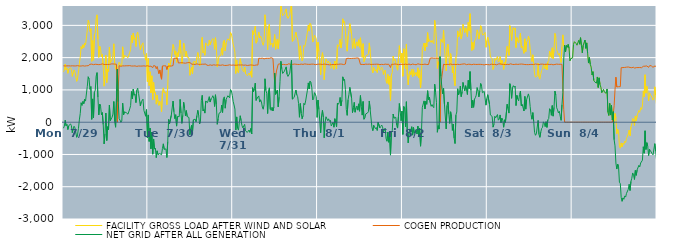
| Category | FACILITY GROSS LOAD AFTER WIND AND SOLAR | COGEN PRODUCTION | NET GRID AFTER ALL GENERATION |
|---|---|---|---|
|  Mon  7/29 | 1560 | 1747 | -187 |
|  Mon  7/29 | 1612 | 1734 | -122 |
|  Mon  7/29 | 1800 | 1741 | 59 |
|  Mon  7/29 | 1627 | 1739 | -112 |
|  Mon  7/29 | 1681 | 1745 | -64 |
|  Mon  7/29 | 1514 | 1743 | -229 |
|  Mon  7/29 | 1637 | 1746 | -109 |
|  Mon  7/29 | 1663 | 1748 | -85 |
|  Mon  7/29 | 1687 | 1742 | -55 |
|  Mon  7/29 | 1642 | 1750 | -108 |
|  Mon  7/29 | 1421 | 1747 | -326 |
|  Mon  7/29 | 1544 | 1756 | -212 |
|  Mon  7/29 | 1617 | 1743 | -126 |
|  Mon  7/29 | 1562 | 1736 | -174 |
|  Mon  7/29 | 1560 | 1743 | -183 |
|  Mon  7/29 | 1267 | 1734 | -467 |
|  Mon  7/29 | 1373 | 1752 | -379 |
|  Mon  7/29 | 1555 | 1746 | -191 |
|  Mon  7/29 | 1810 | 1740 | 70 |
|  Mon  7/29 | 2015 | 1744 | 271 |
|  Mon  7/29 | 2342 | 1740 | 602 |
|  Mon  7/29 | 2268 | 1748 | 520 |
|  Mon  7/29 | 2398 | 1749 | 649 |
|  Mon  7/29 | 2314 | 1744 | 570 |
|  Mon  7/29 | 2452 | 1738 | 714 |
|  Mon  7/29 | 2398 | 1745 | 653 |
|  Mon  7/29 | 2428 | 1747 | 681 |
|  Mon  7/29 | 2849 | 1738 | 1111 |
|  Mon  7/29 | 3157 | 1750 | 1407 |
|  Mon  7/29 | 3076 | 1737 | 1339 |
|  Mon  7/29 | 2814 | 1793 | 1021 |
|  Mon  7/29 | 2897 | 1795 | 1102 |
|  Mon  7/29 | 1887 | 1799 | 88 |
|  Mon  7/29 | 2528 | 1807 | 721 |
|  Mon  7/29 | 1921 | 1782 | 139 |
|  Mon  7/29 | 2704 | 1777 | 927 |
|  Mon  7/29 | 2785 | 1795 | 990 |
|  Mon  7/29 | 3215 | 1791 | 1424 |
|  Mon  7/29 | 3326 | 1790 | 1536 |
|  Mon  7/29 | 2575 | 1796 | 779 |
|  Mon  7/29 | 2006 | 1782 | 224 |
|  Mon  7/29 | 2354 | 1791 | 563 |
|  Mon  7/29 | 2279 | 1789 | 490 |
|  Mon  7/29 | 2021 | 1791 | 230 |
|  Mon  7/29 | 2103 | 1807 | 296 |
|  Mon  7/29 | 1726 | 1799 | -73 |
|  Mon  7/29 | 1116 | 1789 | -673 |
|  Mon  7/29 | 1437 | 1794 | -357 |
|  Mon  7/29 | 2069 | 1787 | 282 |
|  Mon  7/29 | 1228 | 1797 | -569 |
|  Mon  7/29 | 1648 | 1788 | -140 |
|  Mon  7/29 | 1573 | 1803 | -230 |
|  Mon  7/29 | 2320 | 1790 | 530 |
|  Mon  7/29 | 1835 | 1791 | 44 |
|  Mon  7/29 | 1843 | 1804 | 39 |
|  Mon  7/29 | 1925 | 1775 | 150 |
|  Mon  7/29 | 2058 | 1805 | 253 |
|  Mon  7/29 | 2429 | 1788 | 641 |
|  Mon  7/29 | 1816 | 1800 | 16 |
|  Mon  7/29 | 1641 | 1798 | -157 |
|  Mon  7/29 | 1634 | 1795 | -161 |
|  Mon  7/29 | 1641 | 0 | 1641 |
|  Mon  7/29 | 1630 | 999 | 631 |
|  Mon  7/29 | 1860 | 1750 | 110 |
|  Mon  7/29 | 1804 | 1740 | 64 |
|  Mon  7/29 | 1728 | 1732 | -4 |
|  Mon  7/29 | 1767 | 1735 | 32 |
|  Mon  7/29 | 2335 | 1745 | 590 |
|  Mon  7/29 | 1978 | 1753 | 225 |
|  Mon  7/29 | 2064 | 1744 | 320 |
|  Mon  7/29 | 2050 | 1738 | 312 |
|  Mon  7/29 | 2044 | 1748 | 296 |
|  Mon  7/29 | 2069 | 1756 | 313 |
|  Mon  7/29 | 1996 | 1748 | 248 |
|  Mon  7/29 | 1966 | 1740 | 226 |
|  Mon  7/29 | 2164 | 1752 | 412 |
|  Mon  7/29 | 2254 | 1741 | 513 |
|  Mon  7/29 | 2690 | 1740 | 950 |
|  Mon  7/29 | 2460 | 1741 | 719 |
|  Mon  7/29 | 2763 | 1740 | 1023 |
|  Mon  7/29 | 2570 | 1735 | 835 |
|  Mon  7/29 | 2613 | 1744 | 869 |
|  Mon  7/29 | 2344 | 1738 | 606 |
|  Mon  7/29 | 2717 | 1729 | 988 |
|  Mon  7/29 | 2791 | 1738 | 1053 |
|  Mon  7/29 | 2633 | 1741 | 892 |
|  Mon  7/29 | 2648 | 1742 | 906 |
|  Mon  7/29 | 2239 | 1738 | 501 |
|  Mon  7/29 | 2362 | 1728 | 634 |
|  Mon  7/29 | 2353 | 1739 | 614 |
|  Mon  7/29 | 2459 | 1746 | 713 |
|  Mon  7/29 | 2112 | 1745 | 367 |
|  Mon  7/29 | 2074 | 1735 | 339 |
|  Mon  7/29 | 1922 | 1737 | 185 |
|  Mon  7/29 | 2125 | 1735 | 390 |
|  Mon  7/29 | 1259 | 1749 | -490 |
|  Tue  7/30 | 1975 | 1751 | 224 |
|  Tue  7/30 | 1134 | 1731 | -597 |
|  Tue  7/30 | 1563 | 1747 | -184 |
|  Tue  7/30 | 910 | 1735 | -825 |
|  Tue  7/30 | 1438 | 1743 | -305 |
|  Tue  7/30 | 697 | 1689 | -992 |
|  Tue  7/30 | 1233 | 1753 | -520 |
|  Tue  7/30 | 901 | 1736 | -835 |
|  Tue  7/30 | 936 | 1739 | -803 |
|  Tue  7/30 | 558 | 1656 | -1098 |
|  Tue  7/30 | 839 | 1727 | -888 |
|  Tue  7/30 | 617 | 1620 | -1003 |
|  Tue  7/30 | 520 | 1504 | -984 |
|  Tue  7/30 | 646 | 1618 | -972 |
|  Tue  7/30 | 611 | 1588 | -977 |
|  Tue  7/30 | 321 | 1332 | -1011 |
|  Tue  7/30 | 928 | 1742 | -814 |
|  Tue  7/30 | 1063 | 1734 | -671 |
|  Tue  7/30 | 906 | 1748 | -842 |
|  Tue  7/30 | 925 | 1744 | -819 |
|  Tue  7/30 | 914 | 1743 | -829 |
|  Tue  7/30 | 537 | 1632 | -1095 |
|  Tue  7/30 | 1134 | 1734 | -600 |
|  Tue  7/30 | 1833 | 1747 | 86 |
|  Tue  7/30 | 1689 | 1740 | -51 |
|  Tue  7/30 | 1680 | 1737 | -57 |
|  Tue  7/30 | 1953 | 1740 | 213 |
|  Tue  7/30 | 2176 | 1737 | 439 |
|  Tue  7/30 | 2407 | 1754 | 653 |
|  Tue  7/30 | 2304 | 1983 | 321 |
|  Tue  7/30 | 2100 | 1989 | 111 |
|  Tue  7/30 | 2209 | 1978 | 231 |
|  Tue  7/30 | 1856 | 1978 | -122 |
|  Tue  7/30 | 2150 | 1977 | 173 |
|  Tue  7/30 | 2035 | 1834 | 201 |
|  Tue  7/30 | 2020 | 1847 | 173 |
|  Tue  7/30 | 2545 | 1839 | 706 |
|  Tue  7/30 | 2123 | 1839 | 284 |
|  Tue  7/30 | 1808 | 1844 | -36 |
|  Tue  7/30 | 2055 | 1843 | 212 |
|  Tue  7/30 | 2451 | 1834 | 617 |
|  Tue  7/30 | 2290 | 1858 | 432 |
|  Tue  7/30 | 2026 | 1828 | 198 |
|  Tue  7/30 | 2200 | 1840 | 360 |
|  Tue  7/30 | 2016 | 1841 | 175 |
|  Tue  7/30 | 2020 | 1836 | 184 |
|  Tue  7/30 | 1994 | 1849 | 145 |
|  Tue  7/30 | 1453 | 1844 | -391 |
|  Tue  7/30 | 1440 | 1835 | -395 |
|  Tue  7/30 | 1707 | 1796 | -89 |
|  Tue  7/30 | 1495 | 1805 | -310 |
|  Tue  7/30 | 1868 | 1794 | 74 |
|  Tue  7/30 | 1849 | 1793 | 56 |
|  Tue  7/30 | 1882 | 1789 | 93 |
|  Tue  7/30 | 1811 | 1798 | 13 |
|  Tue  7/30 | 2013 | 1806 | 207 |
|  Tue  7/30 | 2158 | 1790 | 368 |
|  Tue  7/30 | 1998 | 1792 | 206 |
|  Tue  7/30 | 1741 | 1794 | -53 |
|  Tue  7/30 | 1816 | 1792 | 24 |
|  Tue  7/30 | 2483 | 1802 | 681 |
|  Tue  7/30 | 2629 | 1797 | 832 |
|  Tue  7/30 | 2144 | 1798 | 346 |
|  Tue  7/30 | 2191 | 1797 | 394 |
|  Tue  7/30 | 2072 | 1791 | 281 |
|  Tue  7/30 | 2457 | 1804 | 653 |
|  Tue  7/30 | 2404 | 1769 | 635 |
|  Tue  7/30 | 2377 | 1770 | 607 |
|  Tue  7/30 | 2369 | 1758 | 611 |
|  Tue  7/30 | 2546 | 1757 | 789 |
|  Tue  7/30 | 2400 | 1776 | 624 |
|  Tue  7/30 | 2492 | 1769 | 723 |
|  Tue  7/30 | 2519 | 1761 | 758 |
|  Tue  7/30 | 2592 | 1772 | 820 |
|  Tue  7/30 | 2526 | 1778 | 748 |
|  Tue  7/30 | 2256 | 1769 | 487 |
|  Tue  7/30 | 2616 | 1767 | 849 |
|  Tue  7/30 | 2310 | 1766 | 544 |
|  Tue  7/30 | 1709 | 1774 | -65 |
|  Tue  7/30 | 1875 | 1768 | 107 |
|  Tue  7/30 | 2043 | 1767 | 276 |
|  Tue  7/30 | 2055 | 1765 | 290 |
|  Tue  7/30 | 2071 | 1763 | 308 |
|  Tue  7/30 | 2295 | 1763 | 532 |
|  Tue  7/30 | 2077 | 1776 | 301 |
|  Tue  7/30 | 2500 | 1770 | 730 |
|  Tue  7/30 | 2543 | 1758 | 785 |
|  Tue  7/30 | 2207 | 1774 | 433 |
|  Tue  7/30 | 2460 | 1758 | 702 |
|  Tue  7/30 | 2532 | 1767 | 765 |
|  Tue  7/30 | 2583 | 1764 | 819 |
|  Tue  7/30 | 2593 | 1761 | 832 |
|  Tue  7/30 | 2533 | 1778 | 755 |
|  Tue  7/30 | 2780 | 1768 | 1012 |
|  Tue  7/30 | 2739 | 1765 | 974 |
|  Tue  7/30 | 2597 | 1766 | 831 |
|  Wed  7/31 | 2415 | 1771 | 644 |
|  Wed  7/31 | 2306 | 1773 | 533 |
|  Wed  7/31 | 2170 | 1765 | 405 |
|  Wed  7/31 | 1508 | 1752 | -244 |
|  Wed  7/31 | 1928 | 1765 | 163 |
|  Wed  7/31 | 1580 | 1768 | -188 |
|  Wed  7/31 | 1527 | 1774 | -247 |
|  Wed  7/31 | 1764 | 1767 | -3 |
|  Wed  7/31 | 1970 | 1771 | 199 |
|  Wed  7/31 | 1804 | 1759 | 45 |
|  Wed  7/31 | 1668 | 1774 | -106 |
|  Wed  7/31 | 1595 | 1773 | -178 |
|  Wed  7/31 | 1560 | 1766 | -206 |
|  Wed  7/31 | 1709 | 1776 | -67 |
|  Wed  7/31 | 1501 | 1770 | -269 |
|  Wed  7/31 | 1476 | 1762 | -286 |
|  Wed  7/31 | 1440 | 1757 | -317 |
|  Wed  7/31 | 1472 | 1773 | -301 |
|  Wed  7/31 | 1522 | 1765 | -243 |
|  Wed  7/31 | 1447 | 1766 | -319 |
|  Wed  7/31 | 1582 | 1774 | -192 |
|  Wed  7/31 | 1394 | 1757 | -363 |
|  Wed  7/31 | 2836 | 1767 | 1069 |
|  Wed  7/31 | 2715 | 1772 | 943 |
|  Wed  7/31 | 2798 | 1759 | 1039 |
|  Wed  7/31 | 2975 | 1765 | 1210 |
|  Wed  7/31 | 2448 | 1772 | 676 |
|  Wed  7/31 | 2502 | 1762 | 740 |
|  Wed  7/31 | 2508 | 1770 | 738 |
|  Wed  7/31 | 2795 | 1981 | 814 |
|  Wed  7/31 | 2610 | 1987 | 623 |
|  Wed  7/31 | 2670 | 1976 | 694 |
|  Wed  7/31 | 2618 | 1986 | 632 |
|  Wed  7/31 | 2455 | 1984 | 471 |
|  Wed  7/31 | 2381 | 1980 | 401 |
|  Wed  7/31 | 2509 | 1961 | 548 |
|  Wed  7/31 | 3328 | 1983 | 1345 |
|  Wed  7/31 | 2959 | 1978 | 981 |
|  Wed  7/31 | 2871 | 1974 | 897 |
|  Wed  7/31 | 2248 | 1979 | 269 |
|  Wed  7/31 | 2941 | 1978 | 963 |
|  Wed  7/31 | 3043 | 1979 | 1064 |
|  Wed  7/31 | 2386 | 1987 | 399 |
|  Wed  7/31 | 2362 | 1998 | 364 |
|  Wed  7/31 | 2450 | 1991 | 459 |
|  Wed  7/31 | 2320 | 1974 | 346 |
|  Wed  7/31 | 2454 | 1991 | 463 |
|  Wed  7/31 | 2716 | 1193 | 1523 |
|  Wed  7/31 | 2258 | 1398 | 860 |
|  Wed  7/31 | 2470 | 1587 | 883 |
|  Wed  7/31 | 2579 | 1590 | 989 |
|  Wed  7/31 | 2273 | 1797 | 476 |
|  Wed  7/31 | 2564 | 1790 | 774 |
|  Wed  7/31 | 3073 | 1807 | 1266 |
|  Wed  7/31 | 3687 | 1800 | 1887 |
|  Wed  7/31 | 3444 | 1788 | 1656 |
|  Wed  7/31 | 3300 | 1790 | 1510 |
|  Wed  7/31 | 3325 | 1790 | 1535 |
|  Wed  7/31 | 3359 | 1779 | 1580 |
|  Wed  7/31 | 3378 | 1782 | 1596 |
|  Wed  7/31 | 3511 | 1797 | 1714 |
|  Wed  7/31 | 3269 | 1782 | 1487 |
|  Wed  7/31 | 3216 | 1798 | 1418 |
|  Wed  7/31 | 3208 | 1811 | 1397 |
|  Wed  7/31 | 3312 | 1795 | 1517 |
|  Wed  7/31 | 3529 | 1789 | 1740 |
|  Wed  7/31 | 3702 | 1785 | 1917 |
|  Wed  7/31 | 2502 | 1789 | 713 |
|  Wed  7/31 | 2496 | 1801 | 695 |
|  Wed  7/31 | 2568 | 1801 | 767 |
|  Wed  7/31 | 2582 | 1794 | 788 |
|  Wed  7/31 | 2790 | 1796 | 994 |
|  Wed  7/31 | 2636 | 1788 | 848 |
|  Wed  7/31 | 2578 | 1789 | 789 |
|  Wed  7/31 | 2364 | 1788 | 576 |
|  Wed  7/31 | 1941 | 1788 | 153 |
|  Wed  7/31 | 2365 | 1787 | 578 |
|  Wed  7/31 | 2080 | 1800 | 280 |
|  Wed  7/31 | 1898 | 1792 | 106 |
|  Wed  7/31 | 1993 | 1790 | 203 |
|  Wed  7/31 | 2380 | 1795 | 585 |
|  Wed  7/31 | 2344 | 1806 | 538 |
|  Wed  7/31 | 2451 | 1794 | 657 |
|  Wed  7/31 | 2445 | 1797 | 648 |
|  Wed  7/31 | 2792 | 1801 | 991 |
|  Wed  7/31 | 3009 | 1792 | 1217 |
|  Wed  7/31 | 2822 | 1793 | 1029 |
|  Wed  7/31 | 3062 | 1792 | 1270 |
|  Wed  7/31 | 3022 | 1784 | 1238 |
|  Wed  7/31 | 2864 | 1799 | 1065 |
|  Wed  7/31 | 2481 | 1794 | 687 |
|  Wed  7/31 | 2519 | 1797 | 722 |
|  Wed  7/31 | 2693 | 1778 | 915 |
|  Wed  7/31 | 2652 | 1782 | 870 |
|  Wed  7/31 | 2585 | 1798 | 787 |
|  Wed  7/31 | 1941 | 1793 | 148 |
|  Thu  8/1 | 2478 | 1793 | 685 |
|  Thu  8/1 | 2191 | 1798 | 393 |
|  Thu  8/1 | 2174 | 1782 | 392 |
|  Thu  8/1 | 1468 | 1796 | -328 |
|  Thu  8/1 | 2008 | 1799 | 209 |
|  Thu  8/1 | 2155 | 1788 | 367 |
|  Thu  8/1 | 1954 | 1797 | 157 |
|  Thu  8/1 | 1318 | 1801 | -483 |
|  Thu  8/1 | 1769 | 1779 | -10 |
|  Thu  8/1 | 1961 | 1793 | 168 |
|  Thu  8/1 | 1955 | 1796 | 159 |
|  Thu  8/1 | 1833 | 1785 | 48 |
|  Thu  8/1 | 1889 | 1785 | 104 |
|  Thu  8/1 | 1802 | 1778 | 24 |
|  Thu  8/1 | 1842 | 1784 | 58 |
|  Thu  8/1 | 1666 | 1782 | -116 |
|  Thu  8/1 | 1725 | 1787 | -62 |
|  Thu  8/1 | 1791 | 1792 | -1 |
|  Thu  8/1 | 1637 | 1793 | -156 |
|  Thu  8/1 | 1891 | 1783 | 108 |
|  Thu  8/1 | 1772 | 1787 | -15 |
|  Thu  8/1 | 1653 | 1795 | -142 |
|  Thu  8/1 | 2398 | 1805 | 593 |
|  Thu  8/1 | 2348 | 1793 | 555 |
|  Thu  8/1 | 2392 | 1786 | 606 |
|  Thu  8/1 | 2567 | 1801 | 766 |
|  Thu  8/1 | 2297 | 1794 | 503 |
|  Thu  8/1 | 2480 | 1799 | 681 |
|  Thu  8/1 | 3204 | 1799 | 1405 |
|  Thu  8/1 | 3080 | 1785 | 1295 |
|  Thu  8/1 | 3120 | 1792 | 1328 |
|  Thu  8/1 | 2813 | 1801 | 1012 |
|  Thu  8/1 | 2358 | 1970 | 388 |
|  Thu  8/1 | 2199 | 1987 | 212 |
|  Thu  8/1 | 2678 | 1981 | 697 |
|  Thu  8/1 | 2830 | 1969 | 861 |
|  Thu  8/1 | 3053 | 1974 | 1079 |
|  Thu  8/1 | 3054 | 1957 | 1097 |
|  Thu  8/1 | 2720 | 1976 | 744 |
|  Thu  8/1 | 2281 | 1984 | 297 |
|  Thu  8/1 | 2435 | 1980 | 455 |
|  Thu  8/1 | 2589 | 1975 | 614 |
|  Thu  8/1 | 2290 | 1981 | 309 |
|  Thu  8/1 | 2417 | 1979 | 438 |
|  Thu  8/1 | 2490 | 1990 | 500 |
|  Thu  8/1 | 2354 | 1981 | 373 |
|  Thu  8/1 | 2552 | 1984 | 568 |
|  Thu  8/1 | 2323 | 1984 | 339 |
|  Thu  8/1 | 2615 | 1791 | 824 |
|  Thu  8/1 | 2276 | 1793 | 483 |
|  Thu  8/1 | 2009 | 1790 | 219 |
|  Thu  8/1 | 2432 | 1791 | 641 |
|  Thu  8/1 | 1876 | 1786 | 90 |
|  Thu  8/1 | 1935 | 1807 | 128 |
|  Thu  8/1 | 2055 | 1799 | 256 |
|  Thu  8/1 | 2032 | 1789 | 243 |
|  Thu  8/1 | 2080 | 1794 | 286 |
|  Thu  8/1 | 2120 | 1797 | 323 |
|  Thu  8/1 | 2456 | 1799 | 657 |
|  Thu  8/1 | 2183 | 1793 | 390 |
|  Thu  8/1 | 2200 | 1788 | 412 |
|  Thu  8/1 | 1631 | 1791 | -160 |
|  Thu  8/1 | 1530 | 1792 | -262 |
|  Thu  8/1 | 1696 | 1792 | -96 |
|  Thu  8/1 | 1711 | 1794 | -83 |
|  Thu  8/1 | 1588 | 1791 | -203 |
|  Thu  8/1 | 1630 | 1797 | -167 |
|  Thu  8/1 | 1537 | 1793 | -256 |
|  Thu  8/1 | 1793 | 1796 | -3 |
|  Thu  8/1 | 1806 | 1781 | 25 |
|  Thu  8/1 | 1607 | 1783 | -176 |
|  Thu  8/1 | 1657 | 1792 | -135 |
|  Thu  8/1 | 1704 | 1793 | -89 |
|  Thu  8/1 | 1656 | 1796 | -140 |
|  Thu  8/1 | 1479 | 1785 | -306 |
|  Thu  8/1 | 1576 | 1798 | -222 |
|  Thu  8/1 | 1614 | 1799 | -185 |
|  Thu  8/1 | 1280 | 1787 | -507 |
|  Thu  8/1 | 1202 | 1792 | -590 |
|  Thu  8/1 | 1478 | 1787 | -309 |
|  Thu  8/1 | 1174 | 1796 | -622 |
|  Thu  8/1 | 1427 | 1791 | -364 |
|  Thu  8/1 | 674 | 1694 | -1020 |
|  Thu  8/1 | 1462 | 1794 | -332 |
|  Thu  8/1 | 1543 | 1802 | -259 |
|  Thu  8/1 | 2044 | 1792 | 252 |
|  Thu  8/1 | 1914 | 1790 | 124 |
|  Thu  8/1 | 1958 | 1804 | 154 |
|  Thu  8/1 | 1948 | 1796 | 152 |
|  Thu  8/1 | 1692 | 1797 | -105 |
|  Thu  8/1 | 1611 | 1794 | -183 |
|  Thu  8/1 | 1964 | 1783 | 181 |
|  Thu  8/1 | 2371 | 1792 | 579 |
|  Thu  8/1 | 2108 | 1789 | 319 |
|  Thu  8/1 | 1840 | 1796 | 44 |
|  Thu  8/1 | 2138 | 1795 | 343 |
|  Fri  8/2 | 1422 | 1801 | -379 |
|  Fri  8/2 | 2277 | 1788 | 489 |
|  Fri  8/2 | 2236 | 1797 | 439 |
|  Fri  8/2 | 1655 | 1798 | -143 |
|  Fri  8/2 | 2422 | 1788 | 634 |
|  Fri  8/2 | 1450 | 1787 | -337 |
|  Fri  8/2 | 1154 | 1795 | -641 |
|  Fri  8/2 | 1480 | 1800 | -320 |
|  Fri  8/2 | 1575 | 1784 | -209 |
|  Fri  8/2 | 1473 | 1779 | -306 |
|  Fri  8/2 | 1643 | 1785 | -142 |
|  Fri  8/2 | 1400 | 1801 | -401 |
|  Fri  8/2 | 1630 | 1795 | -165 |
|  Fri  8/2 | 1444 | 1788 | -344 |
|  Fri  8/2 | 1459 | 1798 | -339 |
|  Fri  8/2 | 1545 | 1780 | -235 |
|  Fri  8/2 | 1423 | 1790 | -367 |
|  Fri  8/2 | 1684 | 1809 | -125 |
|  Fri  8/2 | 1371 | 1797 | -426 |
|  Fri  8/2 | 1609 | 1794 | -185 |
|  Fri  8/2 | 1060 | 1804 | -744 |
|  Fri  8/2 | 1458 | 1789 | -331 |
|  Fri  8/2 | 2253 | 1794 | 459 |
|  Fri  8/2 | 2351 | 1788 | 563 |
|  Fri  8/2 | 2454 | 1795 | 659 |
|  Fri  8/2 | 2210 | 1799 | 411 |
|  Fri  8/2 | 2451 | 1805 | 646 |
|  Fri  8/2 | 2341 | 1786 | 555 |
|  Fri  8/2 | 2774 | 1800 | 974 |
|  Fri  8/2 | 2485 | 1787 | 698 |
|  Fri  8/2 | 2556 | 1781 | 775 |
|  Fri  8/2 | 2586 | 1986 | 600 |
|  Fri  8/2 | 2472 | 1980 | 492 |
|  Fri  8/2 | 2536 | 1991 | 545 |
|  Fri  8/2 | 2471 | 1990 | 481 |
|  Fri  8/2 | 2433 | 1983 | 450 |
|  Fri  8/2 | 3155 | 1979 | 1176 |
|  Fri  8/2 | 2908 | 1984 | 924 |
|  Fri  8/2 | 2583 | 1967 | 616 |
|  Fri  8/2 | 1666 | 1978 | -312 |
|  Fri  8/2 | 1872 | 1980 | -108 |
|  Fri  8/2 | 1774 | 1987 | -213 |
|  Fri  8/2 | 2031 | 0 | 2031 |
|  Fri  8/2 | 2568 | 1141 | 1427 |
|  Fri  8/2 | 2504 | 1385 | 1119 |
|  Fri  8/2 | 2469 | 1590 | 879 |
|  Fri  8/2 | 2854 | 1796 | 1058 |
|  Fri  8/2 | 2350 | 1786 | 564 |
|  Fri  8/2 | 2341 | 1782 | 559 |
|  Fri  8/2 | 1591 | 1800 | -209 |
|  Fri  8/2 | 2307 | 1791 | 516 |
|  Fri  8/2 | 2416 | 1789 | 627 |
|  Fri  8/2 | 2046 | 1789 | 257 |
|  Fri  8/2 | 1745 | 1783 | -38 |
|  Fri  8/2 | 2124 | 1802 | 322 |
|  Fri  8/2 | 1949 | 1783 | 166 |
|  Fri  8/2 | 1531 | 1785 | -254 |
|  Fri  8/2 | 1742 | 1799 | -57 |
|  Fri  8/2 | 1303 | 1794 | -491 |
|  Fri  8/2 | 1127 | 1789 | -662 |
|  Fri  8/2 | 2005 | 1785 | 220 |
|  Fri  8/2 | 2104 | 1788 | 316 |
|  Fri  8/2 | 2829 | 1794 | 1035 |
|  Fri  8/2 | 2640 | 1798 | 842 |
|  Fri  8/2 | 2696 | 1786 | 910 |
|  Fri  8/2 | 2903 | 1785 | 1118 |
|  Fri  8/2 | 2586 | 1794 | 792 |
|  Fri  8/2 | 2720 | 1783 | 937 |
|  Fri  8/2 | 3034 | 1802 | 1232 |
|  Fri  8/2 | 2888 | 1791 | 1097 |
|  Fri  8/2 | 2778 | 1807 | 971 |
|  Fri  8/2 | 2923 | 1793 | 1130 |
|  Fri  8/2 | 2787 | 1783 | 1004 |
|  Fri  8/2 | 2651 | 1793 | 858 |
|  Fri  8/2 | 3092 | 1795 | 1297 |
|  Fri  8/2 | 2834 | 1794 | 1040 |
|  Fri  8/2 | 3362 | 1794 | 1568 |
|  Fri  8/2 | 2768 | 1784 | 984 |
|  Fri  8/2 | 2220 | 1781 | 439 |
|  Fri  8/2 | 2472 | 1796 | 676 |
|  Fri  8/2 | 2257 | 1796 | 461 |
|  Fri  8/2 | 2513 | 1800 | 713 |
|  Fri  8/2 | 2551 | 1790 | 761 |
|  Fri  8/2 | 2626 | 1789 | 837 |
|  Fri  8/2 | 2860 | 1789 | 1071 |
|  Fri  8/2 | 2766 | 1793 | 973 |
|  Fri  8/2 | 2576 | 1792 | 784 |
|  Fri  8/2 | 2749 | 1782 | 967 |
|  Fri  8/2 | 2990 | 1791 | 1199 |
|  Fri  8/2 | 2913 | 1799 | 1114 |
|  Fri  8/2 | 2699 | 1786 | 913 |
|  Fri  8/2 | 2710 | 1786 | 924 |
|  Fri  8/2 | 2728 | 1774 | 954 |
|  Fri  8/2 | 2781 | 1797 | 984 |
|  Fri  8/2 | 2319 | 1791 | 528 |
|  Fri  8/2 | 2526 | 1793 | 733 |
|  Sat  8/3 | 2635 | 1784 | 851 |
|  Sat  8/3 | 2661 | 1787 | 874 |
|  Sat  8/3 | 2337 | 1779 | 558 |
|  Sat  8/3 | 2016 | 1792 | 224 |
|  Sat  8/3 | 2044 | 1798 | 246 |
|  Sat  8/3 | 1971 | 1793 | 178 |
|  Sat  8/3 | 1634 | 1788 | -154 |
|  Sat  8/3 | 1715 | 1783 | -68 |
|  Sat  8/3 | 1976 | 1792 | 184 |
|  Sat  8/3 | 1918 | 1783 | 135 |
|  Sat  8/3 | 1912 | 1778 | 134 |
|  Sat  8/3 | 2039 | 1802 | 237 |
|  Sat  8/3 | 1863 | 1802 | 61 |
|  Sat  8/3 | 1895 | 1798 | 97 |
|  Sat  8/3 | 2031 | 1807 | 224 |
|  Sat  8/3 | 1771 | 1790 | -19 |
|  Sat  8/3 | 1922 | 1794 | 128 |
|  Sat  8/3 | 1840 | 1784 | 56 |
|  Sat  8/3 | 1635 | 1792 | -157 |
|  Sat  8/3 | 1850 | 1777 | 73 |
|  Sat  8/3 | 1778 | 1784 | -6 |
|  Sat  8/3 | 1775 | 1789 | -14 |
|  Sat  8/3 | 2347 | 1793 | 554 |
|  Sat  8/3 | 2230 | 1803 | 427 |
|  Sat  8/3 | 2070 | 1788 | 282 |
|  Sat  8/3 | 2990 | 1797 | 1193 |
|  Sat  8/3 | 2876 | 1809 | 1067 |
|  Sat  8/3 | 2533 | 1794 | 739 |
|  Sat  8/3 | 2863 | 1790 | 1073 |
|  Sat  8/3 | 2930 | 1799 | 1131 |
|  Sat  8/3 | 2868 | 1787 | 1081 |
|  Sat  8/3 | 2921 | 1801 | 1120 |
|  Sat  8/3 | 2312 | 1798 | 514 |
|  Sat  8/3 | 2621 | 1790 | 831 |
|  Sat  8/3 | 2512 | 1790 | 722 |
|  Sat  8/3 | 2455 | 1795 | 660 |
|  Sat  8/3 | 2657 | 1797 | 860 |
|  Sat  8/3 | 2757 | 1793 | 964 |
|  Sat  8/3 | 2308 | 1801 | 507 |
|  Sat  8/3 | 2357 | 1803 | 554 |
|  Sat  8/3 | 2339 | 1797 | 542 |
|  Sat  8/3 | 2133 | 1787 | 346 |
|  Sat  8/3 | 2583 | 1786 | 797 |
|  Sat  8/3 | 2188 | 1784 | 404 |
|  Sat  8/3 | 2483 | 1785 | 698 |
|  Sat  8/3 | 2526 | 1798 | 728 |
|  Sat  8/3 | 2660 | 1783 | 877 |
|  Sat  8/3 | 2564 | 1788 | 776 |
|  Sat  8/3 | 2272 | 1789 | 483 |
|  Sat  8/3 | 2034 | 1796 | 238 |
|  Sat  8/3 | 1881 | 1790 | 91 |
|  Sat  8/3 | 2088 | 1792 | 296 |
|  Sat  8/3 | 1810 | 1787 | 23 |
|  Sat  8/3 | 1486 | 1801 | -315 |
|  Sat  8/3 | 1396 | 1802 | -406 |
|  Sat  8/3 | 1423 | 1784 | -361 |
|  Sat  8/3 | 1436 | 1794 | -358 |
|  Sat  8/3 | 1831 | 1777 | 54 |
|  Sat  8/3 | 1402 | 1781 | -379 |
|  Sat  8/3 | 1334 | 1803 | -469 |
|  Sat  8/3 | 1488 | 1798 | -310 |
|  Sat  8/3 | 1602 | 1795 | -193 |
|  Sat  8/3 | 1639 | 1798 | -159 |
|  Sat  8/3 | 1787 | 1776 | 11 |
|  Sat  8/3 | 1759 | 1790 | -31 |
|  Sat  8/3 | 1648 | 1784 | -136 |
|  Sat  8/3 | 1808 | 1794 | 14 |
|  Sat  8/3 | 1623 | 1784 | -161 |
|  Sat  8/3 | 1868 | 1797 | 71 |
|  Sat  8/3 | 1906 | 1792 | 114 |
|  Sat  8/3 | 2205 | 1786 | 419 |
|  Sat  8/3 | 2183 | 1798 | 385 |
|  Sat  8/3 | 2006 | 1793 | 213 |
|  Sat  8/3 | 2306 | 1791 | 515 |
|  Sat  8/3 | 1965 | 1778 | 187 |
|  Sat  8/3 | 2259 | 1800 | 459 |
|  Sat  8/3 | 2751 | 1788 | 963 |
|  Sat  8/3 | 2637 | 1796 | 841 |
|  Sat  8/3 | 2245 | 1800 | 445 |
|  Sat  8/3 | 2169 | 1788 | 381 |
|  Sat  8/3 | 2078 | 1793 | 285 |
|  Sat  8/3 | 2133 | 1794 | 339 |
|  Sat  8/3 | 1977 | 1795 | 182 |
|  Sat  8/3 | 1849 | 1792 | 57 |
|  Sat  8/3 | 2335 | 1793 | 542 |
|  Sat  8/3 | 2706 | 1794 | 912 |
|  Sat  8/3 | 2352 | 394 | 1958 |
|  Sat  8/3 | 2386 | 0 | 2386 |
|  Sat  8/3 | 2176 | 0 | 2176 |
|  Sat  8/3 | 2378 | 0 | 2378 |
|  Sat  8/3 | 2319 | 0 | 2319 |
|  Sat  8/3 | 2411 | 0 | 2411 |
|  Sat  8/3 | 2288 | 0 | 2288 |
|  Sat  8/3 | 1906 | 0 | 1906 |
|  Sat  8/3 | 1967 | 0 | 1967 |
|  Sat  8/3 | 1974 | 0 | 1974 |
|  Sun  8/4 | 1995 | 0 | 1995 |
|  Sun  8/4 | 2407 | 0 | 2407 |
|  Sun  8/4 | 2494 | 0 | 2494 |
|  Sun  8/4 | 2465 | 0 | 2465 |
|  Sun  8/4 | 2439 | 0 | 2439 |
|  Sun  8/4 | 2385 | 0 | 2385 |
|  Sun  8/4 | 2374 | 0 | 2374 |
|  Sun  8/4 | 2539 | 0 | 2539 |
|  Sun  8/4 | 2415 | 0 | 2415 |
|  Sun  8/4 | 2618 | 0 | 2618 |
|  Sun  8/4 | 2372 | 0 | 2372 |
|  Sun  8/4 | 2149 | 0 | 2149 |
|  Sun  8/4 | 2384 | 0 | 2384 |
|  Sun  8/4 | 2358 | 0 | 2358 |
|  Sun  8/4 | 2546 | 0 | 2546 |
|  Sun  8/4 | 2287 | 0 | 2287 |
|  Sun  8/4 | 2457 | 0 | 2457 |
|  Sun  8/4 | 2141 | 0 | 2141 |
|  Sun  8/4 | 1832 | 0 | 1832 |
|  Sun  8/4 | 2002 | 0 | 2002 |
|  Sun  8/4 | 1796 | 0 | 1796 |
|  Sun  8/4 | 1707 | 0 | 1707 |
|  Sun  8/4 | 1464 | 0 | 1464 |
|  Sun  8/4 | 1565 | 0 | 1565 |
|  Sun  8/4 | 1294 | 0 | 1294 |
|  Sun  8/4 | 1250 | 0 | 1250 |
|  Sun  8/4 | 1278 | 0 | 1278 |
|  Sun  8/4 | 1210 | 0 | 1210 |
|  Sun  8/4 | 1401 | 0 | 1401 |
|  Sun  8/4 | 1075 | 0 | 1075 |
|  Sun  8/4 | 1375 | 0 | 1375 |
|  Sun  8/4 | 1162 | 0 | 1162 |
|  Sun  8/4 | 1086 | 0 | 1086 |
|  Sun  8/4 | 910 | 0 | 910 |
|  Sun  8/4 | 890 | 0 | 890 |
|  Sun  8/4 | 1016 | 0 | 1016 |
|  Sun  8/4 | 931 | 0 | 931 |
|  Sun  8/4 | 936 | 0 | 936 |
|  Sun  8/4 | 896 | 0 | 896 |
|  Sun  8/4 | 1029 | 0 | 1029 |
|  Sun  8/4 | 307 | 0 | 307 |
|  Sun  8/4 | 208 | 0 | 208 |
|  Sun  8/4 | 581 | 0 | 581 |
|  Sun  8/4 | 221 | 0 | 221 |
|  Sun  8/4 | 518 | 0 | 518 |
|  Sun  8/4 | 67 | 0 | 67 |
|  Sun  8/4 | 326 | 0 | 326 |
|  Sun  8/4 | -33 | 511 | -544 |
|  Sun  8/4 | 269 | 1003 | -734 |
|  Sun  8/4 | 129 | 1394 | -1265 |
|  Sun  8/4 | -361 | 1091 | -1452 |
|  Sun  8/4 | -218 | 1081 | -1299 |
|  Sun  8/4 | -279 | 1100 | -1379 |
|  Sun  8/4 | -758 | 1102 | -1860 |
|  Sun  8/4 | -805 | 1101 | -1906 |
|  Sun  8/4 | -643 | 1689 | -2332 |
|  Sun  8/4 | -763 | 1688 | -2451 |
|  Sun  8/4 | -654 | 1692 | -2346 |
|  Sun  8/4 | -690 | 1699 | -2389 |
|  Sun  8/4 | -589 | 1696 | -2285 |
|  Sun  8/4 | -631 | 1690 | -2321 |
|  Sun  8/4 | -501 | 1705 | -2206 |
|  Sun  8/4 | -501 | 1700 | -2201 |
|  Sun  8/4 | -369 | 1710 | -2079 |
|  Sun  8/4 | -244 | 1681 | -1925 |
|  Sun  8/4 | -420 | 1695 | -2115 |
|  Sun  8/4 | -147 | 1689 | -1836 |
|  Sun  8/4 | -49 | 1687 | -1736 |
|  Sun  8/4 | 115 | 1688 | -1573 |
|  Sun  8/4 | 66 | 1706 | -1640 |
|  Sun  8/4 | -102 | 1673 | -1775 |
|  Sun  8/4 | 193 | 1688 | -1495 |
|  Sun  8/4 | 44 | 1691 | -1647 |
|  Sun  8/4 | 204 | 1681 | -1477 |
|  Sun  8/4 | 215 | 1692 | -1477 |
|  Sun  8/4 | 363 | 1699 | -1336 |
|  Sun  8/4 | 309 | 1694 | -1385 |
|  Sun  8/4 | 450 | 1715 | -1265 |
|  Sun  8/4 | 393 | 1688 | -1295 |
|  Sun  8/4 | 501 | 1680 | -1179 |
|  Sun  8/4 | 969 | 1731 | -762 |
|  Sun  8/4 | 787 | 1749 | -962 |
|  Sun  8/4 | 1470 | 1736 | -266 |
|  Sun  8/4 | 898 | 1744 | -846 |
|  Sun  8/4 | 1108 | 1743 | -635 |
|  Sun  8/4 | 981 | 1728 | -747 |
|  Sun  8/4 | 665 | 1698 | -1033 |
|  Sun  8/4 | 909 | 1748 | -839 |
|  Sun  8/4 | 864 | 1743 | -879 |
|  Sun  8/4 | 893 | 1752 | -859 |
|  Sun  8/4 | 757 | 1737 | -980 |
|  Sun  8/4 | 683 | 1695 | -1012 |
|  Sun  8/4 | 744 | 1732 | -988 |
|  Sun  8/4 | 1096 | 1762 | -666 |
|  Sun  8/4 | 832 | 1738 | -906 |
|  Sun  8/4 | 535 | 1707 | -1172 |